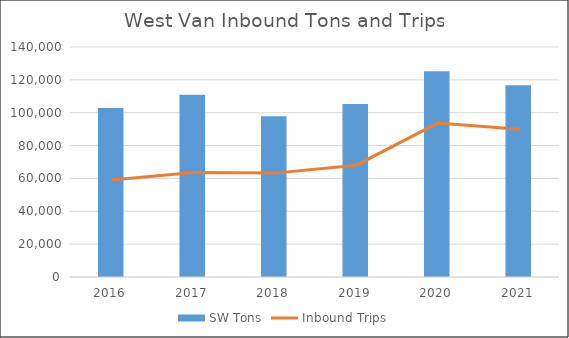
| Category | SW Tons |
|---|---|
| 2016.0 | 102798 |
| 2017.0 | 110865 |
| 2018.0 | 97792 |
| 2019.0 | 105299 |
| 2020.0 | 125247 |
| 2021.0 | 116719.15 |